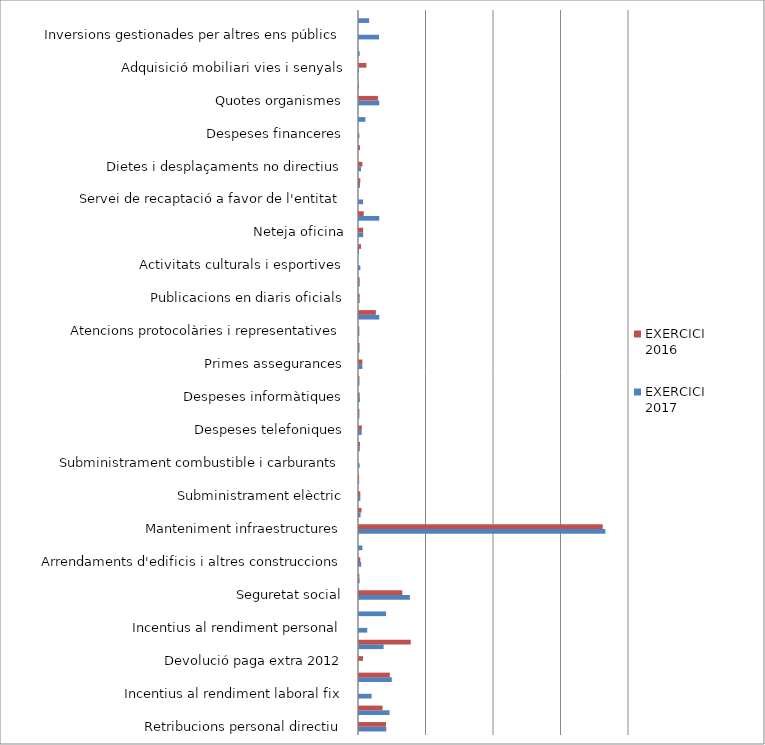
| Category | EXERCICI 2017 | EXERCICI 2016 |
|---|---|---|
| Retribucions personal directiu | 40400 | 40000 |
| Retribucions personal laboral | 45226.51 | 34906.9 |
| Incentius al rendiment laboral fix | 18657.43 | 0 |
| Altres remuneracions p. laboral | 48602.72 | 45644.2 |
| Devolució paga extra 2012 | 0 | 5876.22 |
| Retribucions personal temporal | 36509.67 | 76629.14 |
| Incentius al rendiment personal | 12219.58 | 0 |
| Altres remuneracions personal temporal | 40125.79 | 0 |
| Seguretat social | 75421.86 | 64179.29 |
| Formació | 1000 | 500 |
| Arrendaments d'edificis i altres construccions | 3200 | 1920 |
| Arrendaments de material de transport | 5000 | 0 |
| Manteniment infraestructures | 365000 | 361123.78 |
| Material Oficina | 2300 | 3700 |
| Subministrament elèctric | 2000 | 2000 |
| Subministrament aigua | 200 | 150 |
| Subministrament combustible i carburants | 1000 | 0 |
| Altres subministraments | 1200 | 1500 |
| Despeses telefoniques | 4000 | 4200 |
| Correus | 600 | 600 |
| Despeses informàtiques | 1300 | 1000 |
| Despeses diverses en missatgeria | 700 | 600 |
| Primes assegurances | 5000 | 5000 |
| Tributs de les entitats locals. | 800 | 800 |
| Atencions protocolàries i representatives | 500 | 500 |
| Difusió i publicitat de les Vies Verdes i Pirnexus | 30000 | 25000 |
| Publicacions en diaris oficials | 1000 | 1000 |
| Fires i jornades tècniques | 1000 | 1000 |
| Activitats culturals i esportives | 2000 | 0 |
| Altres despeses diverses | 10 | 3000 |
| Neteja oficina | 6200 | 6200 |
| Estudis i treballs realitzats per altres empreses | 30000 | 7000 |
| Servei de recaptació a favor de l'entitat | 6000 | 0 |
| Dietes i desplaçaments directius | 1500 | 2000 |
| Dietes i desplaçaments no directius | 3000 | 5000 |
| Despeses financeres | 0 | 1500 |
| Despeses financeres | 600 | 0 |
| Premis i beques. Subvencions a favor d'enitats sense ànim de | 9500 | 0 |
| Quotes organismes | 30000 | 28000 |
| Inv. de reposició en infraestructures per a l'ús general | 10 | 0 |
| Adquisició mobiliari vies i senyals | 10 | 11000 |
| Adquisió informàtica | 1000 | 0 |
| Inversions gestionades per altres ens públics | 29663.31 | 0 |
| Adquisició mobiliari vies i senyals per a altres ens | 15000 | 0 |